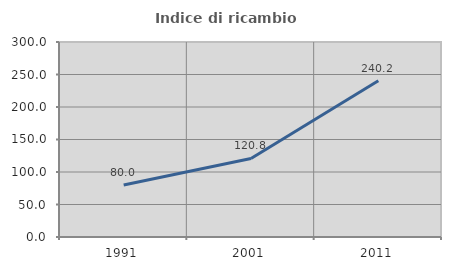
| Category | Indice di ricambio occupazionale  |
|---|---|
| 1991.0 | 79.952 |
| 2001.0 | 120.846 |
| 2011.0 | 240.244 |